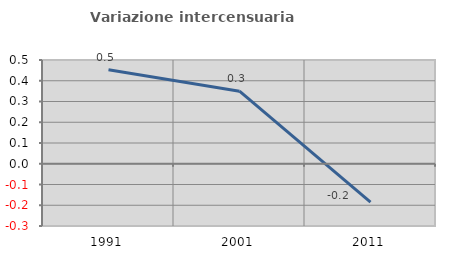
| Category | Variazione intercensuaria annua |
|---|---|
| 1991.0 | 0.453 |
| 2001.0 | 0.35 |
| 2011.0 | -0.185 |